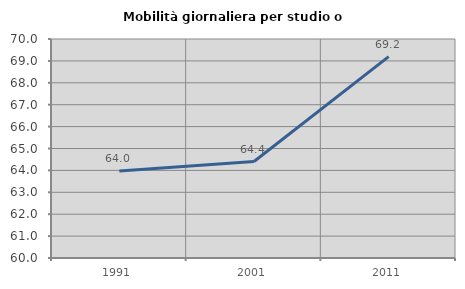
| Category | Mobilità giornaliera per studio o lavoro |
|---|---|
| 1991.0 | 63.974 |
| 2001.0 | 64.404 |
| 2011.0 | 69.196 |